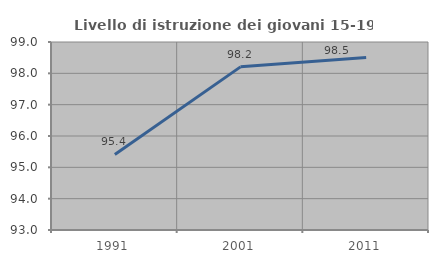
| Category | Livello di istruzione dei giovani 15-19 anni |
|---|---|
| 1991.0 | 95.413 |
| 2001.0 | 98.206 |
| 2011.0 | 98.507 |